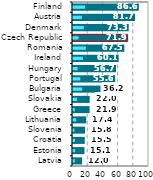
| Category |  Total |
|---|---|
| Latvia | 12.016 |
| Estonia | 15.058 |
| Croatia | 15.493 |
| Slovenia | 15.835 |
| Lithuania | 17.388 |
| Greece | 21.89 |
| Slovakia | 22.002 |
| Bulgaria | 36.182 |
| Portugal | 55.563 |
| Hungary | 56.722 |
| Ireland | 60.131 |
| Romania | 67.503 |
| Czech Republic | 71.858 |
| Denmark | 73.334 |
| Austria | 81.677 |
| Finland | 86.621 |